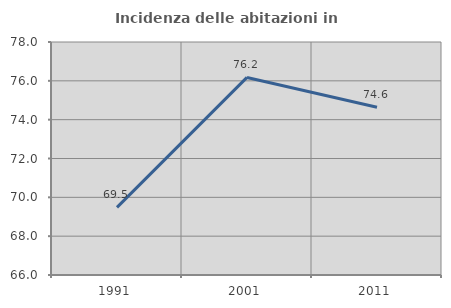
| Category | Incidenza delle abitazioni in proprietà  |
|---|---|
| 1991.0 | 69.481 |
| 2001.0 | 76.175 |
| 2011.0 | 74.64 |